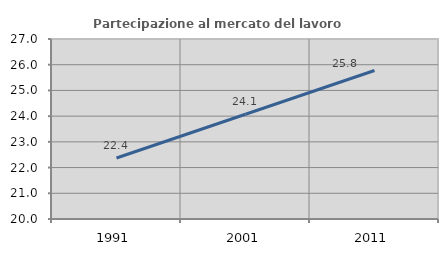
| Category | Partecipazione al mercato del lavoro  femminile |
|---|---|
| 1991.0 | 22.371 |
| 2001.0 | 24.073 |
| 2011.0 | 25.774 |